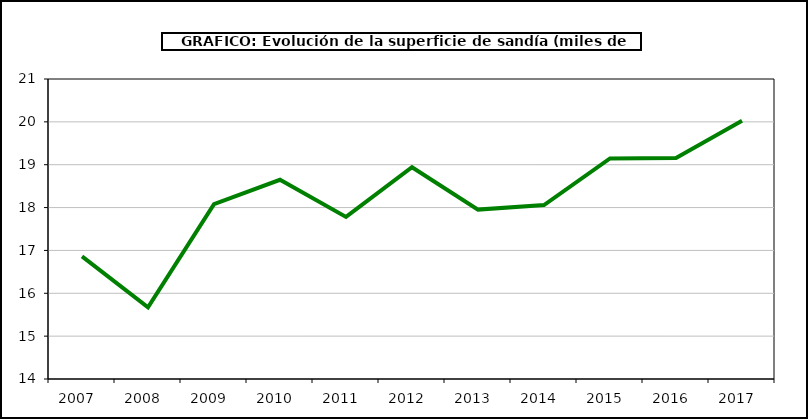
| Category | superficie |
|---|---|
| 2007.0 | 16.861 |
| 2008.0 | 15.674 |
| 2009.0 | 18.082 |
| 2010.0 | 18.648 |
| 2011.0 | 17.783 |
| 2012.0 | 18.942 |
| 2013.0 | 17.953 |
| 2014.0 | 18.059 |
| 2015.0 | 19.147 |
| 2016.0 | 19.156 |
| 2017.0 | 20.026 |